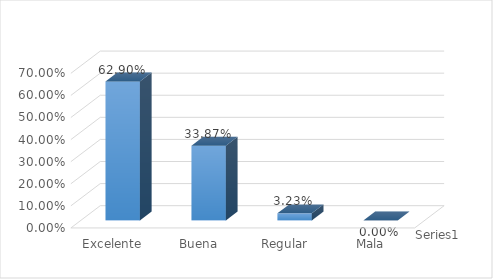
| Category | Series 0 |
|---|---|
| Excelente | 0.629 |
| Buena | 0.339 |
| Regular | 0.032 |
| Mala | 0 |